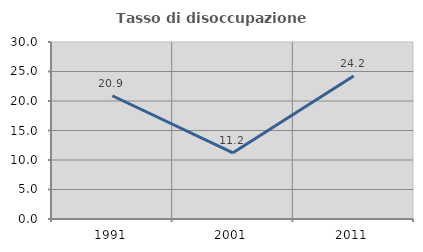
| Category | Tasso di disoccupazione giovanile  |
|---|---|
| 1991.0 | 20.888 |
| 2001.0 | 11.213 |
| 2011.0 | 24.229 |